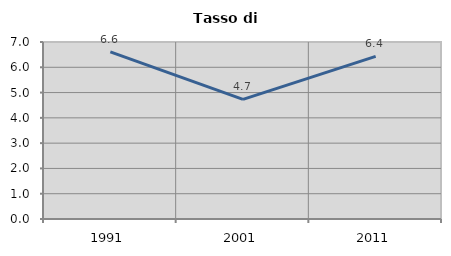
| Category | Tasso di disoccupazione   |
|---|---|
| 1991.0 | 6.608 |
| 2001.0 | 4.73 |
| 2011.0 | 6.434 |